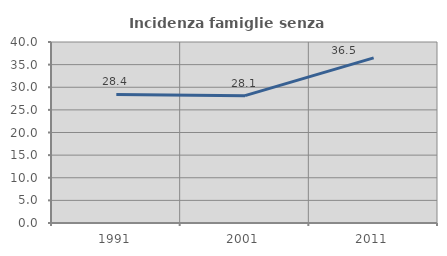
| Category | Incidenza famiglie senza nuclei |
|---|---|
| 1991.0 | 28.421 |
| 2001.0 | 28.141 |
| 2011.0 | 36.486 |